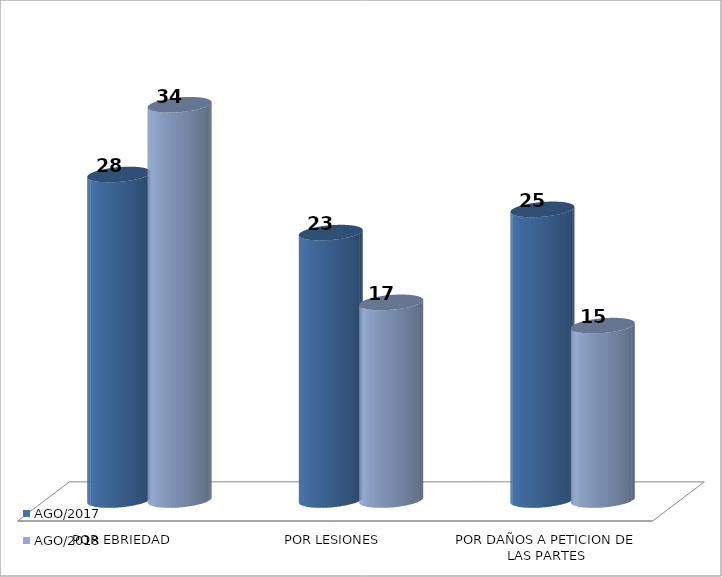
| Category | AGO/2017 | AGO/2018 |
|---|---|---|
| POR EBRIEDAD | 28 | 34 |
| POR LESIONES | 23 | 17 |
| POR DAÑOS A PETICION DE LAS PARTES | 25 | 15 |